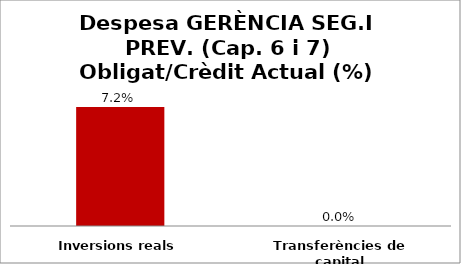
| Category | Series 0 |
|---|---|
| Inversions reals | 0.072 |
| Transferències de capital | 0 |